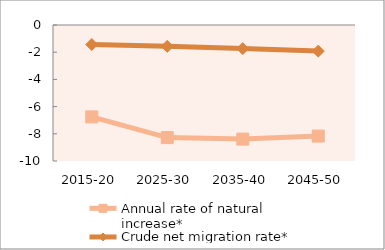
| Category | Annual rate of natural increase* | Crude net migration rate* |
|---|---|---|
| 2015-20 | -6.757 | -1.435 |
| 2025-30 | -8.278 | -1.57 |
| 2035-40 | -8.39 | -1.737 |
| 2045-50 | -8.167 | -1.92 |